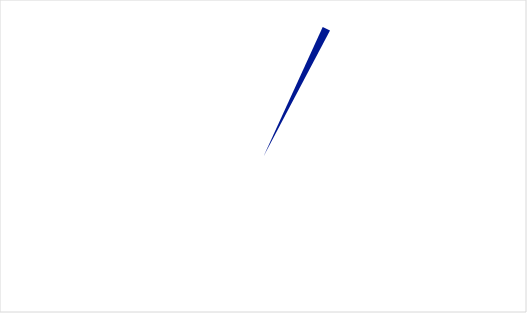
| Category | Series 0 |
|---|---|
| 0 | 70 |
| 1 | 2 |
| 2 | 148 |